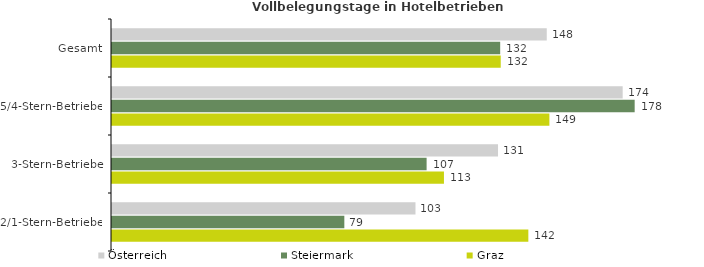
| Category | Österreich | Steiermark | Graz |
|---|---|---|---|
| Gesamt | 147.876 | 132.038 | 132.222 |
| 5/4-Stern-Betriebe | 173.697 | 177.779 | 148.772 |
| 3-Stern-Betriebe | 131.294 | 107.011 | 112.909 |
| 2/1-Stern-Betriebe | 103.222 | 79.024 | 141.612 |